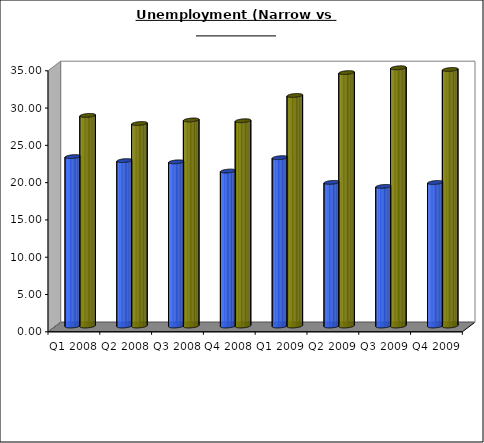
| Category | Unemployment rate | Unemployment Rate (Expanded Def) |
|---|---|---|
| Q1 2008 | 22.715 | 28.235 |
| Q2 2008 | 22.179 | 27.151 |
| Q3 2008 | 22.011 | 27.627 |
| Q4 2008 | 20.777 | 27.522 |
| Q1 2009 | 22.568 | 30.911 |
| Q2 2009 | 19.257 | 33.98 |
| Q3 2009 | 18.717 | 34.623 |
| Q4 2009 | 19.242 | 34.395 |